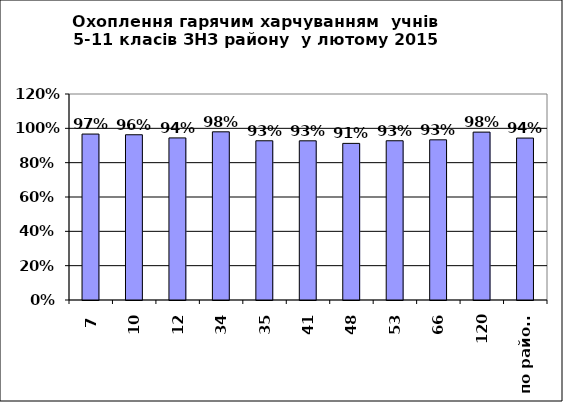
| Category | 116 309 491 385 |
|---|---|
| 7 | 0.967 |
| 10 | 0.963 |
| 12 | 0.944 |
| 34 | 0.98 |
| 35 | 0.928 |
| 41 | 0.927 |
| 48 | 0.912 |
| 53 | 0.928 |
| 66 | 0.933 |
| 120 | 0.978 |
| по району | 0.943 |